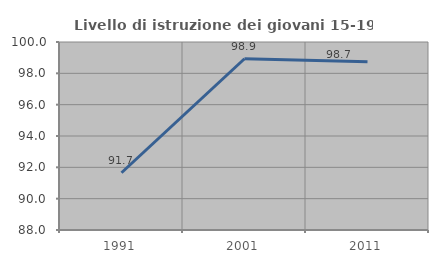
| Category | Livello di istruzione dei giovani 15-19 anni |
|---|---|
| 1991.0 | 91.653 |
| 2001.0 | 98.932 |
| 2011.0 | 98.737 |